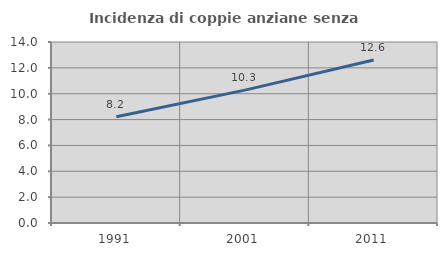
| Category | Incidenza di coppie anziane senza figli  |
|---|---|
| 1991.0 | 8.224 |
| 2001.0 | 10.276 |
| 2011.0 | 12.602 |